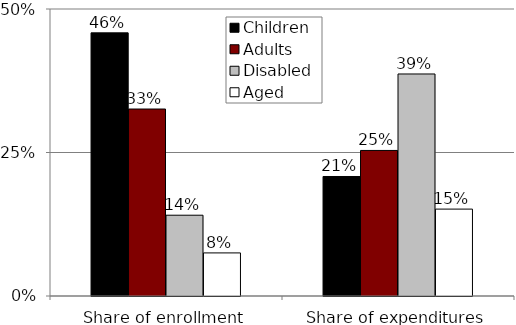
| Category | Children | Adults | Disabled | Aged |
|---|---|---|---|---|
| Share of enrollment | 0.458 | 0.326 | 0.141 | 0.075 |
| Share of expenditures | 0.208 | 0.254 | 0.387 | 0.151 |